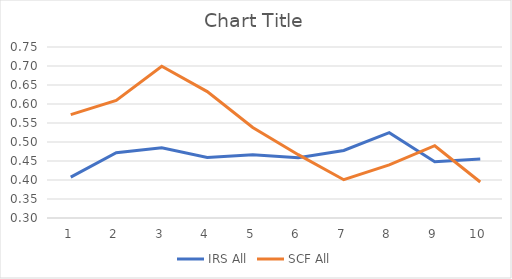
| Category | IRS All | SCF All |
|---|---|---|
| 0 | 0.408 | 0.572 |
| 1 | 0.472 | 0.609 |
| 2 | 0.485 | 0.699 |
| 3 | 0.459 | 0.633 |
| 4 | 0.466 | 0.538 |
| 5 | 0.459 | 0.467 |
| 6 | 0.478 | 0.401 |
| 7 | 0.525 | 0.44 |
| 8 | 0.448 | 0.49 |
| 9 | 0.455 | 0.395 |